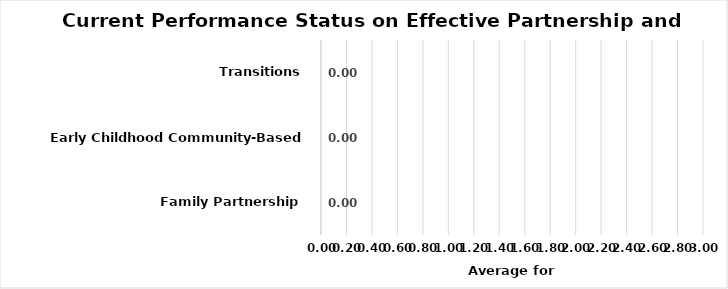
| Category | Current Performance Status on
Effective Partnership and Collaboration |
|---|---|
| Family Partnership | 0 |
| Early Childhood Community-Based Partners | 0 |
| Transitions | 0 |